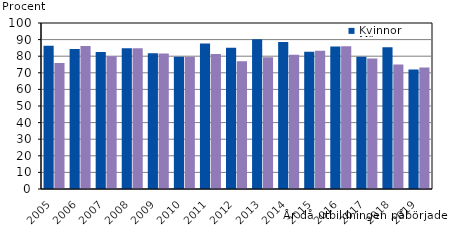
| Category | Kvinnor | Män |
|---|---|---|
| 2005.0 | 86.364 | 75.909 |
| 2006.0 | 84.375 | 86.096 |
| 2007.0 | 82.53 | 80 |
| 2008.0 | 84.795 | 84.762 |
| 2009.0 | 81.771 | 81.579 |
| 2010.0 | 79.651 | 79.71 |
| 2011.0 | 87.629 | 81.364 |
| 2012.0 | 85.065 | 76.884 |
| 2013.0 | 90.141 | 79.381 |
| 2014.0 | 88.623 | 80.808 |
| 2015.0 | 82.667 | 83.254 |
| 2016.0 | 85.821 | 85.955 |
| 2017.0 | 79.605 | 78.652 |
| 2018.0 | 85.35 | 75 |
| 2019.0 | 72.05 | 73.184 |